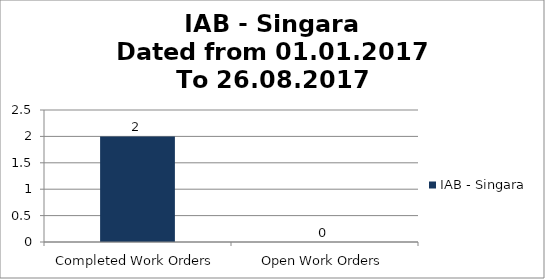
| Category | IAB - Singara |
|---|---|
| Completed Work Orders | 2 |
| Open Work Orders | 0 |